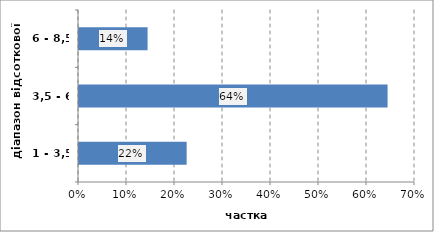
| Category | Series 0 |
|---|---|
| 1 - 3,5 | 0.224 |
| 3,5 - 6 | 0.643 |
| 6 - 8,5 | 0.143 |